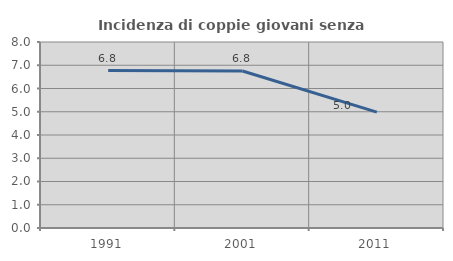
| Category | Incidenza di coppie giovani senza figli |
|---|---|
| 1991.0 | 6.772 |
| 2001.0 | 6.752 |
| 2011.0 | 4.984 |